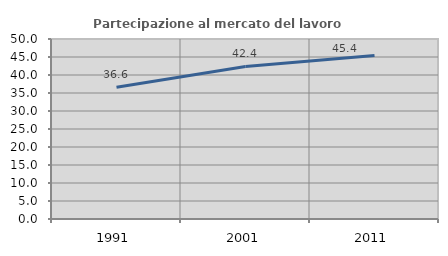
| Category | Partecipazione al mercato del lavoro  femminile |
|---|---|
| 1991.0 | 36.62 |
| 2001.0 | 42.377 |
| 2011.0 | 45.441 |